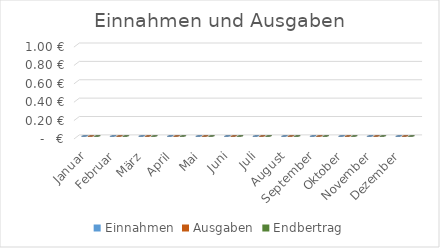
| Category | Einnahmen | Ausgaben | Endbertrag |
|---|---|---|---|
| Januar | 0 | 0 | 0 |
| Februar | 0 | 0 | 0 |
| März | 0 | 0 | 0 |
| April | 0 | 0 | 0 |
| Mai | 0 | 0 | 0 |
| Juni | 0 | 0 | 0 |
| Juli | 0 | 0 | 0 |
| August | 0 | 0 | 0 |
| September | 0 | 0 | 0 |
| Oktober | 0 | 0 | 0 |
| November | 0 | 0 | 0 |
| Dezember | 0 | 0 | 0 |